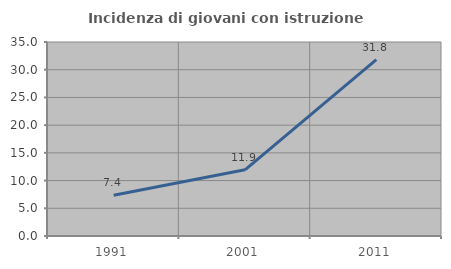
| Category | Incidenza di giovani con istruzione universitaria |
|---|---|
| 1991.0 | 7.368 |
| 2001.0 | 11.94 |
| 2011.0 | 31.818 |